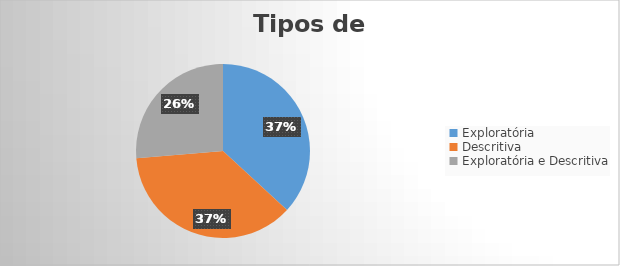
| Category | Series 0 |
|---|---|
| Exploratória | 7 |
| Descritiva | 7 |
| Exploratória e Descritiva | 5 |